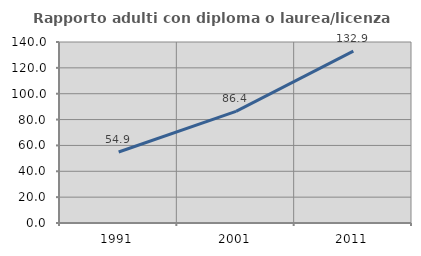
| Category | Rapporto adulti con diploma o laurea/licenza media  |
|---|---|
| 1991.0 | 54.924 |
| 2001.0 | 86.371 |
| 2011.0 | 132.898 |